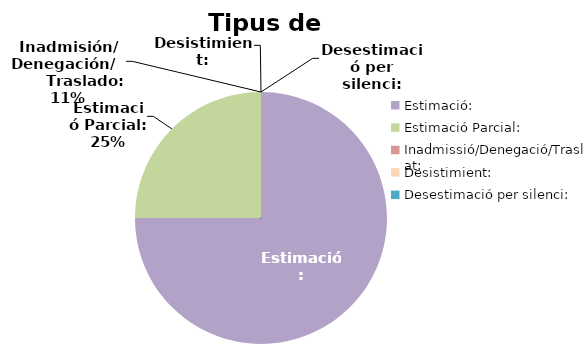
| Category | Tipus de resolució |
|---|---|
| Estimació: | 3 |
| Estimació Parcial: | 1 |
| Inadmissió/Denegació/Trasllat: | 0 |
| Desistimient: | 0 |
| Desestimació per silenci: | 0 |